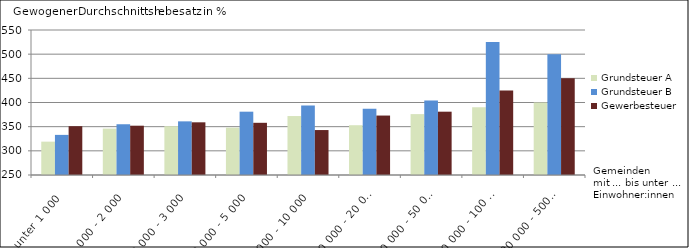
| Category | Grundsteuer A | Grundsteuer B | Gewerbesteuer |
|---|---|---|---|
| unter 1 000 | 319 | 333 | 351 |
| 1 000 - 2 000 | 346 | 355 | 352 |
| 2 000 - 3 000 | 351 | 361 | 359 |
| 3 000 - 5 000 | 348 | 381 | 358 |
| 5 000 - 10 000 | 372 | 394 | 343 |
| 10 000 - 20 000 | 353 | 387 | 373 |
| 20 000 - 50 000 | 376 | 404 | 381 |
| 50 000 - 100 000 | 390 | 525 | 425 |
| 200 000 - 500 000 | 400 | 500 | 450 |